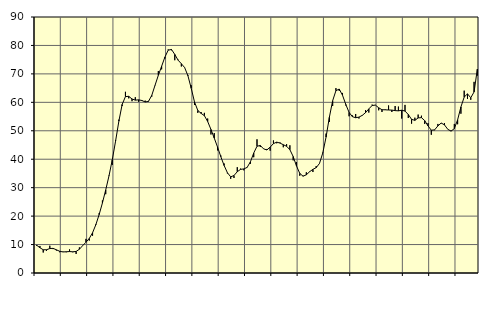
| Category | Piggar | Series 1 |
|---|---|---|
| nan | 9.5 | 9.77 |
| 87.0 | 9.5 | 8.88 |
| 87.0 | 7.2 | 8.17 |
| 87.0 | 7.8 | 8.17 |
| nan | 9.6 | 8.6 |
| 88.0 | 8.4 | 8.66 |
| 88.0 | 7.9 | 8.16 |
| 88.0 | 7.3 | 7.64 |
| nan | 7.5 | 7.4 |
| 89.0 | 7.3 | 7.47 |
| 89.0 | 8.3 | 7.54 |
| 89.0 | 7.3 | 7.45 |
| nan | 6.7 | 7.58 |
| 90.0 | 9 | 8.34 |
| 90.0 | 9.7 | 9.63 |
| 90.0 | 12 | 10.82 |
| nan | 11.4 | 12.14 |
| 91.0 | 13.1 | 14.15 |
| 91.0 | 17.2 | 16.98 |
| 91.0 | 21 | 20.53 |
| nan | 25.5 | 24.63 |
| 92.0 | 27.7 | 29.2 |
| 92.0 | 34.3 | 34.16 |
| 92.0 | 38 | 39.82 |
| nan | 46.7 | 46.35 |
| 93.0 | 53.9 | 53.38 |
| 93.0 | 58.7 | 59.24 |
| 93.0 | 63.7 | 62.02 |
| nan | 61.4 | 62.11 |
| 94.0 | 60.4 | 61.18 |
| 94.0 | 61.8 | 60.77 |
| 94.0 | 60.2 | 60.88 |
| nan | 60.8 | 60.64 |
| 95.0 | 60.6 | 60.13 |
| 95.0 | 60.5 | 60.33 |
| 95.0 | 62 | 62.44 |
| nan | 65.9 | 65.99 |
| 96.0 | 71 | 69.5 |
| 96.0 | 71.6 | 72.68 |
| 96.0 | 75.4 | 75.91 |
| nan | 78.6 | 78.34 |
| 97.0 | 78.3 | 78.59 |
| 97.0 | 74.8 | 76.85 |
| 97.0 | 75 | 74.83 |
| nan | 72.6 | 73.58 |
| 98.0 | 72.3 | 72.22 |
| 98.0 | 69.6 | 69.35 |
| 98.0 | 66 | 64.94 |
| nan | 59.1 | 60.13 |
| 99.0 | 56.3 | 57.14 |
| 99.0 | 56.6 | 56.12 |
| 99.0 | 56.3 | 55.31 |
| nan | 54.3 | 53.27 |
| 0.0 | 48.7 | 50.46 |
| 0.0 | 49.2 | 47.44 |
| 0.0 | 43.1 | 44.29 |
| nan | 41.3 | 40.9 |
| 1.0 | 38.5 | 37.79 |
| 1.0 | 35 | 35.26 |
| 1.0 | 33.1 | 33.81 |
| nan | 33.4 | 34.27 |
| 2.0 | 37.2 | 35.61 |
| 2.0 | 36.7 | 36.43 |
| 2.0 | 36.1 | 36.6 |
| nan | 37.2 | 37.12 |
| 3.0 | 38.4 | 39.1 |
| 3.0 | 40.7 | 42.17 |
| 3.0 | 47 | 44.57 |
| nan | 44.3 | 44.83 |
| 4.0 | 43.7 | 43.65 |
| 4.0 | 43.6 | 43.26 |
| 4.0 | 43 | 44.25 |
| nan | 46.6 | 45.49 |
| 5.0 | 45.6 | 46.01 |
| 5.0 | 45.9 | 45.67 |
| 5.0 | 44.2 | 45.1 |
| nan | 45.3 | 44.55 |
| 6.0 | 44.9 | 43.35 |
| 6.0 | 39.6 | 40.95 |
| 6.0 | 39 | 37.66 |
| nan | 34.2 | 35.03 |
| 7.0 | 34.2 | 34.03 |
| 7.0 | 35.4 | 34.53 |
| 7.0 | 35.5 | 35.61 |
| nan | 35.5 | 36.44 |
| 8.0 | 37.6 | 37.04 |
| 8.0 | 38.6 | 38.52 |
| 8.0 | 42.3 | 42.19 |
| nan | 49 | 47.79 |
| 9.0 | 53.1 | 54.73 |
| 9.0 | 58.7 | 60.56 |
| 9.0 | 65 | 64.09 |
| nan | 64 | 64.67 |
| 10.0 | 63.3 | 62.5 |
| 10.0 | 58.9 | 59.26 |
| 10.0 | 55.1 | 56.45 |
| nan | 55.4 | 54.96 |
| 11.0 | 55.9 | 54.59 |
| 11.0 | 54.3 | 54.8 |
| 11.0 | 55.3 | 55.41 |
| nan | 57.3 | 56.36 |
| 12.0 | 56.4 | 57.69 |
| 12.0 | 59.2 | 58.89 |
| 12.0 | 59.1 | 59.02 |
| nan | 57.2 | 58.09 |
| 13.0 | 56.6 | 57.4 |
| 13.0 | 57.5 | 57.37 |
| 13.0 | 58.9 | 57.3 |
| nan | 56.6 | 57.27 |
| 14.0 | 58.7 | 57.09 |
| 14.0 | 58.5 | 57.01 |
| 14.0 | 54.3 | 57.23 |
| nan | 59.1 | 56.93 |
| 15.0 | 54.5 | 55.72 |
| 15.0 | 52.5 | 54.03 |
| 15.0 | 54.6 | 53.66 |
| nan | 55.7 | 54.52 |
| 16.0 | 55.3 | 54.62 |
| 16.0 | 52.4 | 53.56 |
| 16.0 | 52.7 | 51.71 |
| nan | 48.6 | 50.2 |
| 17.0 | 50.2 | 50.32 |
| 17.0 | 52.4 | 51.71 |
| 17.0 | 52.6 | 52.73 |
| nan | 52.7 | 52.08 |
| 18.0 | 50.5 | 50.53 |
| 18.0 | 50 | 49.88 |
| 18.0 | 52.4 | 50.76 |
| nan | 52.3 | 53.85 |
| 19.0 | 56 | 58.38 |
| 19.0 | 64.1 | 61.85 |
| 19.0 | 61.2 | 62.98 |
| nan | 60.9 | 61.61 |
| 20.0 | 67.2 | 63.65 |
| 20.0 | 69.4 | 71.68 |